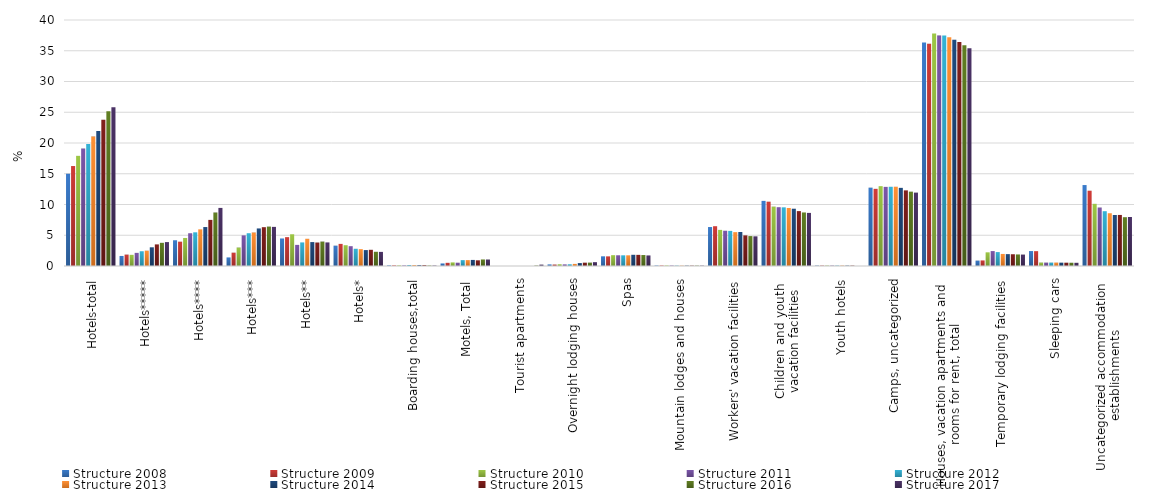
| Category | Structure 2008 | Structure 2009 | Structure 2010 | Structure 2011 | Structure 2012 | Structure 2013 | Structure 2014 | Structure 2015 | Structure 2016 | Structure 2017 |
|---|---|---|---|---|---|---|---|---|---|---|
| Hotels-total | 14.999 | 16.255 | 17.907 | 19.096 | 19.841 | 21.049 | 21.96 | 23.772 | 25.147 | 25.823 |
| Hotels***** | 1.634 | 1.852 | 1.81 | 2.134 | 2.401 | 2.487 | 3.04 | 3.513 | 3.767 | 3.888 |
| Hotels**** | 4.187 | 3.95 | 4.558 | 5.327 | 5.478 | 5.961 | 6.334 | 7.498 | 8.696 | 9.445 |
| Hotels*** | 1.397 | 2.166 | 2.998 | 4.982 | 5.33 | 5.441 | 6.108 | 6.311 | 6.405 | 6.361 |
| Hotels** | 4.478 | 4.692 | 5.159 | 3.431 | 3.836 | 4.42 | 3.89 | 3.815 | 3.969 | 3.837 |
| Hotels* | 3.304 | 3.594 | 3.381 | 3.222 | 2.797 | 2.739 | 2.588 | 2.634 | 2.309 | 2.293 |
| Boarding houses,total | 0.109 | 0.108 | 0.103 | 0.102 | 0.164 | 0.156 | 0.154 | 0.152 | 0.084 | 0.083 |
| Motels, Total | 0.418 | 0.516 | 0.588 | 0.532 | 0.957 | 0.962 | 0.988 | 0.926 | 1.062 | 1.05 |
| Tourist apartments | 0 | 0 | 0 | 0 | 0 | 0 | 0 | 0 | 0.07 | 0.222 |
| Overnight lodging houses | 0.262 | 0.234 | 0.282 | 0.264 | 0.279 | 0.34 | 0.475 | 0.54 | 0.549 | 0.624 |
| Spas | 1.576 | 1.568 | 1.761 | 1.745 | 1.739 | 1.74 | 1.821 | 1.812 | 1.782 | 1.718 |
| Mountain lodges and houses | 0.087 | 0.086 | 0.087 | 0.086 | 0.063 | 0.059 | 0.064 | 0.063 | 0.062 | 0.061 |
| Workers' vacation facilities | 6.336 | 6.471 | 5.87 | 5.73 | 5.706 | 5.505 | 5.526 | 4.98 | 4.865 | 4.824 |
| Children and youth 
vacation facilities | 10.587 | 10.454 | 9.65 | 9.562 | 9.537 | 9.43 | 9.311 | 8.925 | 8.706 | 8.634 |
| Youth hotels | 0.069 | 0.069 | 0.069 | 0.069 | 0.069 | 0.069 | 0.068 | 0.067 | 0 | 0 |
| Camps, uncategorized | 12.736 | 12.544 | 12.982 | 12.864 | 12.877 | 12.882 | 12.706 | 12.298 | 12.085 | 11.93 |
| Houses, vacation apartments and 
rooms for rent, total | 36.353 | 36.132 | 37.817 | 37.472 | 37.487 | 37.215 | 36.793 | 36.408 | 35.878 | 35.394 |
| Temporary lodging facilities | 0.874 | 0.909 | 2.224 | 2.426 | 2.264 | 1.96 | 1.931 | 1.911 | 1.88 | 1.854 |
| Sleeping cars | 2.431 | 2.415 | 0.556 | 0.551 | 0.549 | 0.549 | 0.543 | 0.537 | 0.528 | 0.521 |
| Uncategorized accommodation 
establishments | 13.163 | 12.238 | 10.105 | 9.501 | 8.911 | 8.58 | 8.292 | 8.302 | 7.934 | 7.969 |